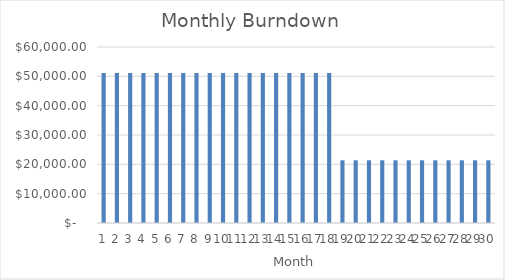
| Category | Series 0 |
|---|---|
| 0 | 51125.351 |
| 1 | 51125.351 |
| 2 | 51125.351 |
| 3 | 51125.351 |
| 4 | 51125.351 |
| 5 | 51125.351 |
| 6 | 51125.351 |
| 7 | 51125.351 |
| 8 | 51125.351 |
| 9 | 51125.351 |
| 10 | 51125.351 |
| 11 | 51125.351 |
| 12 | 51125.351 |
| 13 | 51125.351 |
| 14 | 51125.351 |
| 15 | 51125.351 |
| 16 | 51125.351 |
| 17 | 51125.351 |
| 18 | 21376.951 |
| 19 | 21376.951 |
| 20 | 21376.951 |
| 21 | 21376.951 |
| 22 | 21376.951 |
| 23 | 21376.951 |
| 24 | 21376.951 |
| 25 | 21376.951 |
| 26 | 21376.951 |
| 27 | 21376.951 |
| 28 | 21376.951 |
| 29 | 21376.951 |